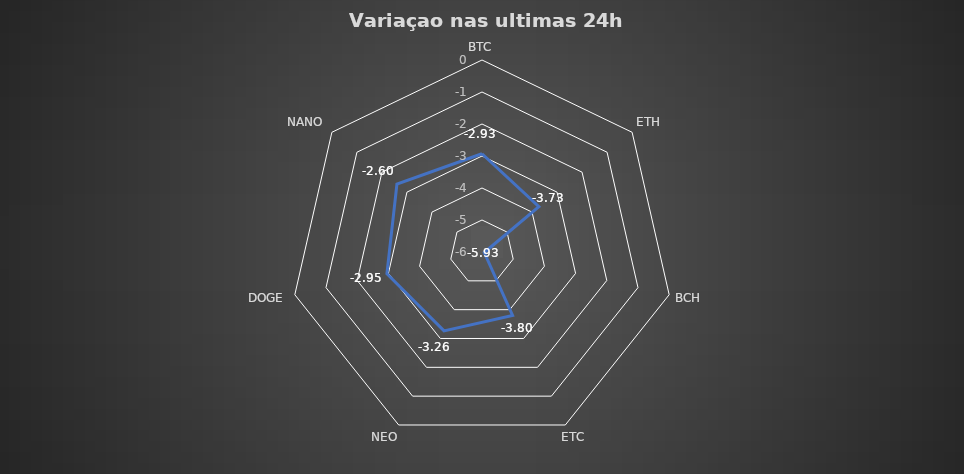
| Category | 24h % |
|---|---|
| BTC | -2.93 |
| ETH | -3.727 |
| BCH | -5.927 |
| ETC | -3.798 |
| NEO | -3.262 |
| DOGE | -2.953 |
| NANO | -2.6 |